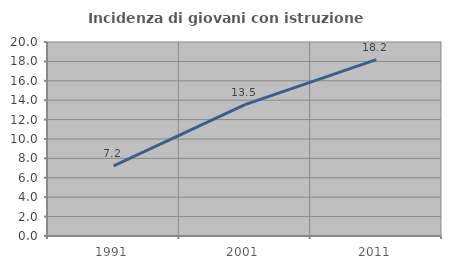
| Category | Incidenza di giovani con istruzione universitaria |
|---|---|
| 1991.0 | 7.229 |
| 2001.0 | 13.542 |
| 2011.0 | 18.182 |